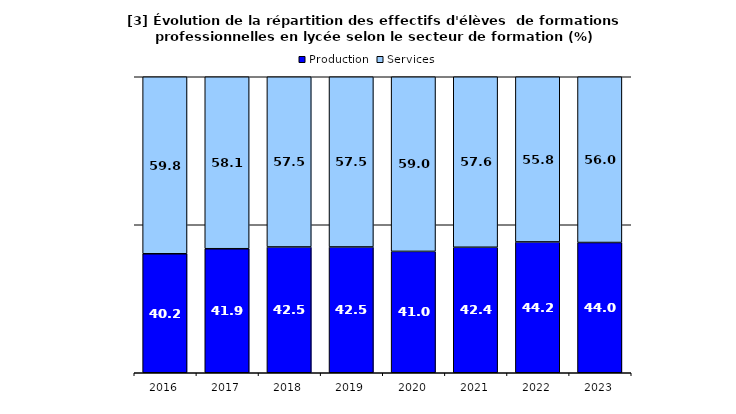
| Category | Production | Services |
|---|---|---|
| 2016.0 | 40.2 | 59.8 |
| 2017.0 | 41.9 | 58.1 |
| 2018.0 | 42.5 | 57.5 |
| 2019.0 | 42.5 | 57.5 |
| 2020.0 | 41 | 59 |
| 2021.0 | 42.4 | 57.6 |
| 2022.0 | 44.2 | 55.8 |
| 2023.0 | 44 | 56 |